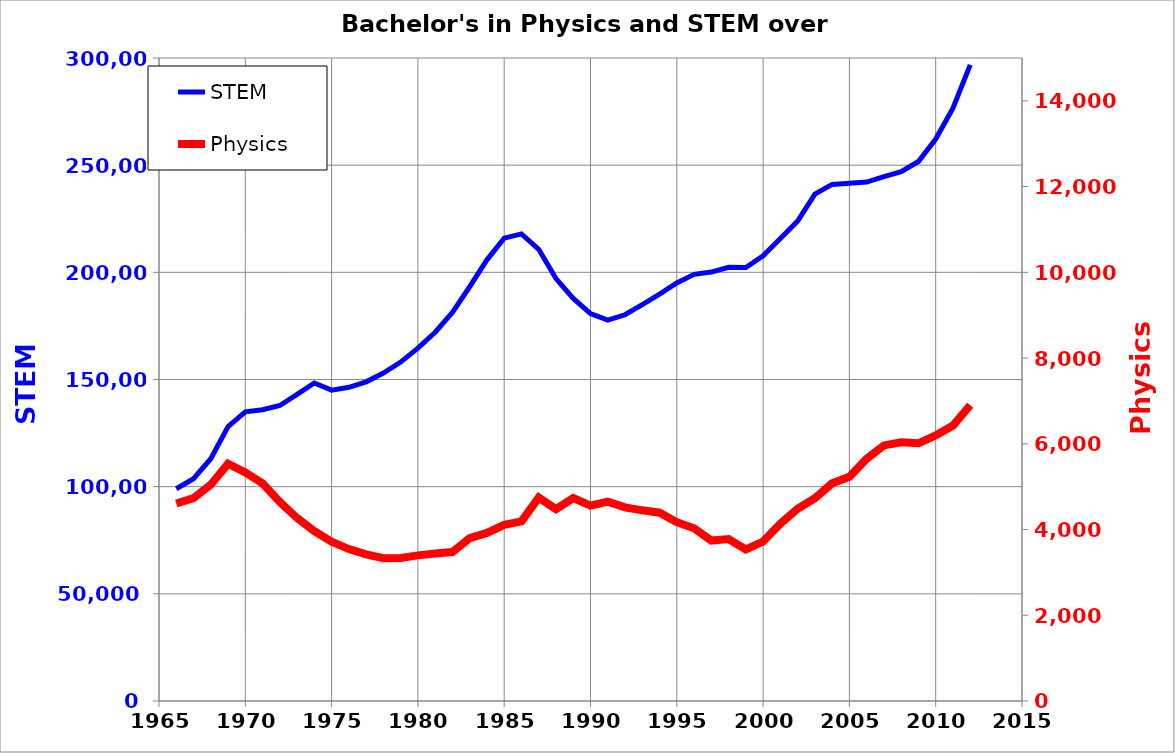
| Category | STEM |
|---|---|
| 1966.0 | 99013 |
| 1967.0 | 103727 |
| 1968.0 | 113023 |
| 1969.0 | 128064 |
| 1970.0 | 134934 |
| 1971.0 | 135877 |
| 1972.0 | 137853 |
| 1973.0 | 143065 |
| 1974.0 | 148369 |
| 1975.0 | 145055 |
| 1976.0 | 146342 |
| 1977.0 | 148909 |
| 1978.0 | 153011 |
| 1979.0 | 158124 |
| 1980.0 | 164619 |
| 1981.0 | 172042 |
| 1982.0 | 181272 |
| 1983.0 | 193271 |
| 1984.0 | 205838 |
| 1985.0 | 215945 |
| 1986.0 | 217936 |
| 1987.0 | 210750 |
| 1988.0 | 197090 |
| 1989.0 | 187843 |
| 1990.0 | 180752 |
| 1991.0 | 177683 |
| 1992.0 | 180201 |
| 1993.0 | 184950 |
| 1994.0 | 189875 |
| 1995.0 | 195031 |
| 1996.0 | 199047 |
| 1997.0 | 200108 |
| 1998.0 | 202374 |
| 1999.0 | 202228 |
| 2000.0 | 207721 |
| 2001.0 | 215838 |
| 2002.0 | 223901 |
| 2003.0 | 236500 |
| 2004.0 | 241030 |
| 2005.0 | 241603 |
| 2006.0 | 242118 |
| 2007.0 | 244681 |
| 2008.0 | 246937 |
| 2009.0 | 251703 |
| 2010.0 | 262200 |
| 2011.0 | 276573 |
| 2012.0 | 296781 |